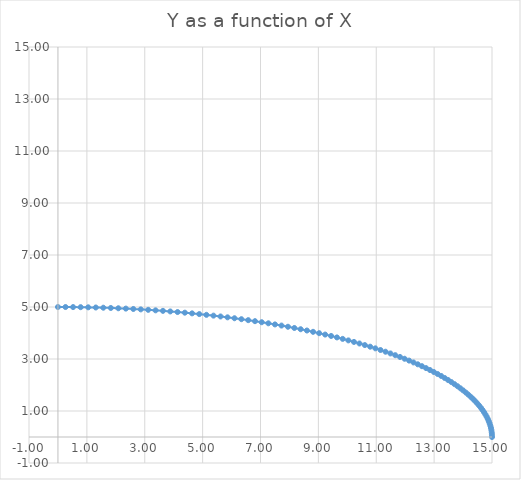
| Category | Y as a function of X |
|---|---|
| 15.0 | 0 |
| 14.997715427345868 | 0.087 |
| 14.990862405286437 | 0.174 |
| 14.979443021318607 | 0.262 |
| 14.963460753897364 | 0.349 |
| 14.942920471376183 | 0.436 |
| 14.9178284305241 | 0.523 |
| 14.88819227461983 | 0.609 |
| 14.854021031123555 | 0.696 |
| 14.815325108927066 | 0.782 |
| 14.772116295183121 | 0.868 |
| 14.72440775171496 | 0.954 |
| 14.672214011007085 | 1.04 |
| 14.615550971778529 | 1.125 |
| 14.554435894139948 | 1.21 |
| 14.488887394336025 | 1.294 |
| 14.418925439074783 | 1.378 |
| 14.344571339445531 | 1.462 |
| 14.265847744427303 | 1.545 |
| 14.182778633989752 | 1.628 |
| 14.095389311788626 | 1.71 |
| 14.003706397458027 | 1.792 |
| 13.90775781850181 | 1.873 |
| 13.807572801786606 | 1.954 |
| 13.703181864639014 | 2.034 |
| 13.59461680554975 | 2.113 |
| 13.481910694487505 | 2.192 |
| 13.365097862825518 | 2.27 |
| 13.244213892883906 | 2.347 |
| 13.119295607090937 | 2.424 |
| 12.99038105676658 | 2.5 |
| 12.857509510531685 | 2.575 |
| 12.72072144234639 | 2.65 |
| 12.58005851918136 | 2.723 |
| 12.435563588325625 | 2.796 |
| 12.287280664334878 | 2.868 |
| 12.135254915624213 | 2.939 |
| 11.979532650709393 | 3.009 |
| 11.82016130410083 | 3.078 |
| 11.657189421854564 | 3.147 |
| 11.49066664678467 | 3.214 |
| 11.320643703341581 | 3.28 |
| 11.147172382160914 | 3.346 |
| 10.970305524287559 | 3.41 |
| 10.790097005079767 | 3.473 |
| 10.606601717798213 | 3.536 |
| 10.41987555688496 | 3.597 |
| 10.229975400937477 | 3.657 |
| 10.036959095382873 | 3.716 |
| 9.84088543485761 | 3.774 |
| 9.64181414529809 | 3.83 |
| 9.439805865747562 | 3.886 |
| 9.234922129884874 | 3.94 |
| 9.027225347280726 | 3.993 |
| 8.816778784387097 | 4.045 |
| 8.603646545265692 | 4.096 |
| 8.387893552061202 | 4.145 |
| 8.169585525225408 | 4.193 |
| 7.948788963498074 | 4.24 |
| 7.725571123650815 | 4.286 |
| 7.500000000000002 | 4.33 |
| 7.272144303695057 | 4.373 |
| 7.042073441788363 | 4.415 |
| 6.809857496093202 | 4.455 |
| 6.5755672018361615 | 4.494 |
| 6.339273926110492 | 4.532 |
| 6.101049646137003 | 4.568 |
| 5.860966927339109 | 4.603 |
| 5.619098901238679 | 4.636 |
| 5.375519243179506 | 4.668 |
| 5.130302149885033 | 4.698 |
| 4.883522316857351 | 4.728 |
| 4.635254915624212 | 4.755 |
| 4.385575570841052 | 4.782 |
| 4.134560337254987 | 4.806 |
| 3.882285676537811 | 4.83 |
| 3.6288284339950185 | 4.851 |
| 3.374265815157974 | 4.872 |
| 3.1186753622663916 | 4.891 |
| 2.862134930648174 | 4.908 |
| 2.604722665003956 | 4.924 |
| 2.346516975603464 | 4.938 |
| 2.0875965144009854 | 4.951 |
| 1.8280401510772124 | 4.963 |
| 1.5679269490148018 | 4.973 |
| 1.307336141214872 | 4.981 |
| 1.0463471061618819 | 4.988 |
| 0.7850393436441595 | 4.993 |
| 0.5234924505375163 | 4.997 |
| 0.26178609655925067 | 4.999 |
| 9.18861341181465e-16 | 5 |